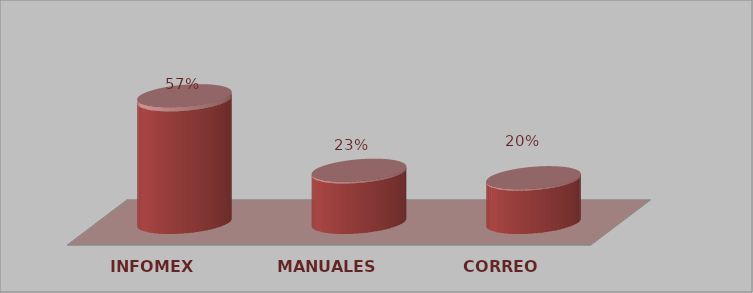
| Category | Series 0 | Series 1 |
|---|---|---|
| INFOMEX | 17 | 0.567 |
| MANUALES | 7 | 0.233 |
| CORREO | 6 | 0.2 |